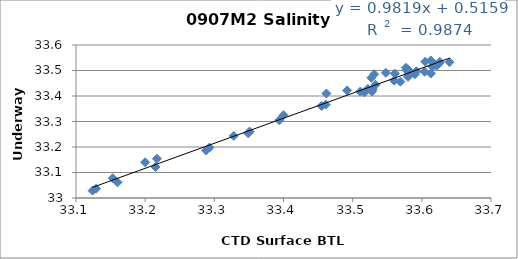
| Category | Sal |
|---|---|
| 33.531 | 33.486 |
| 33.581 | 33.486 |
| 33.59 | 33.486 |
| 33.582 | 33.49 |
| 33.615 | 33.516 |
| 33.569 | 33.456 |
| 33.511 | 33.417 |
| 33.592 | 33.497 |
| 33.328 | 33.244 |
| 33.288 | 33.187 |
| 33.4 | 33.325 |
| 33.394 | 33.305 |
| 33.351 | 33.26 |
| 33.528 | 33.418 |
| 33.293 | 33.198 |
| 33.215 | 33.122 |
| 33.16 | 33.062 |
| 33.461 | 33.366 |
| 33.527 | 33.471 |
| 33.625 | 33.527 |
| 33.58 | 33.475 |
| 33.522 | 33.428 |
| 33.619 | 33.521 |
| 33.626 | 33.534 |
| 33.548 | 33.491 |
| 33.455 | 33.361 |
| 33.56 | 33.46 |
| 33.529 | 33.426 |
| 33.604 | 33.495 |
| 33.517 | 33.414 |
| 33.613 | 33.488 |
| 33.64 | 33.532 |
| 33.581 | 33.481 |
| 33.622 | 33.52 |
| 33.349 | 33.254 |
| 33.533 | 33.444 |
| 33.153 | 33.078 |
| 33.124 | 33.029 |
| 33.217 | 33.154 |
| 33.2 | 33.14 |
| 33.462 | 33.41 |
| 33.561 | 33.488 |
| 33.577 | 33.511 |
| 33.492 | 33.422 |
| 33.605 | 33.535 |
| 33.613 | 33.539 |
| 33.578 | 33.501 |
| 33.58 | 33.505 |
| 33.129 | 33.036 |